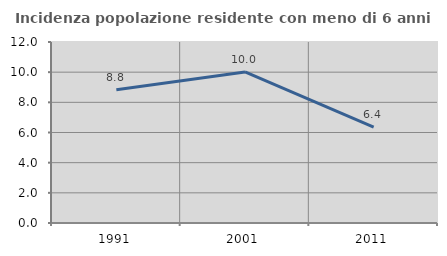
| Category | Incidenza popolazione residente con meno di 6 anni |
|---|---|
| 1991.0 | 8.828 |
| 2001.0 | 10.014 |
| 2011.0 | 6.36 |